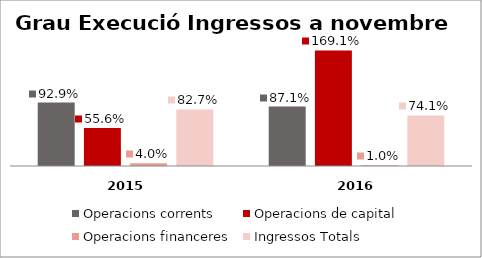
| Category | Operacions corrents | Operacions de capital | Operacions financeres | Ingressos Totals |
|---|---|---|---|---|
| 0 | 0.929 | 0.556 | 0.04 | 0.827 |
| 1 | 0.871 | 1.691 | 0.01 | 0.741 |